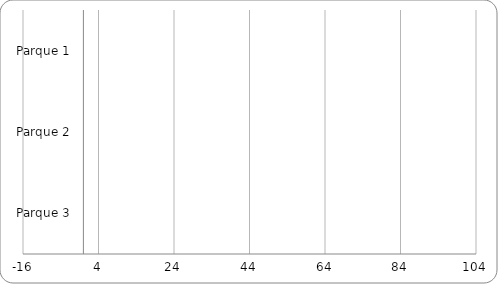
| Category | Puntaje obtenido por cumplimiento de indicadores voluntarios |
|---|---|
| Parque 1 | 0 |
| Parque 2 | 0 |
| Parque 3 | 0 |